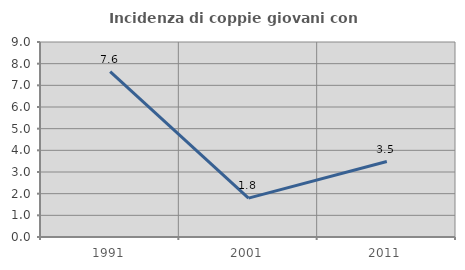
| Category | Incidenza di coppie giovani con figli |
|---|---|
| 1991.0 | 7.629 |
| 2001.0 | 1.792 |
| 2011.0 | 3.483 |